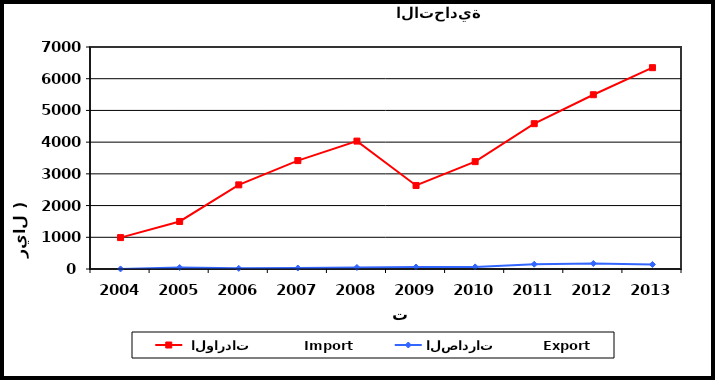
| Category |  الواردات           Import | الصادرات          Export |
|---|---|---|
| 2004.0 | 990 | 2 |
| 2005.0 | 1499 | 46 |
| 2006.0 | 2653 | 20 |
| 2007.0 | 3418 | 31 |
| 2008.0 | 4033 | 48 |
| 2009.0 | 2634 | 63 |
| 2010.0 | 3386 | 67 |
| 2011.0 | 4582 | 151 |
| 2012.0 | 5495 | 174 |
| 2013.0 | 6348 | 143 |